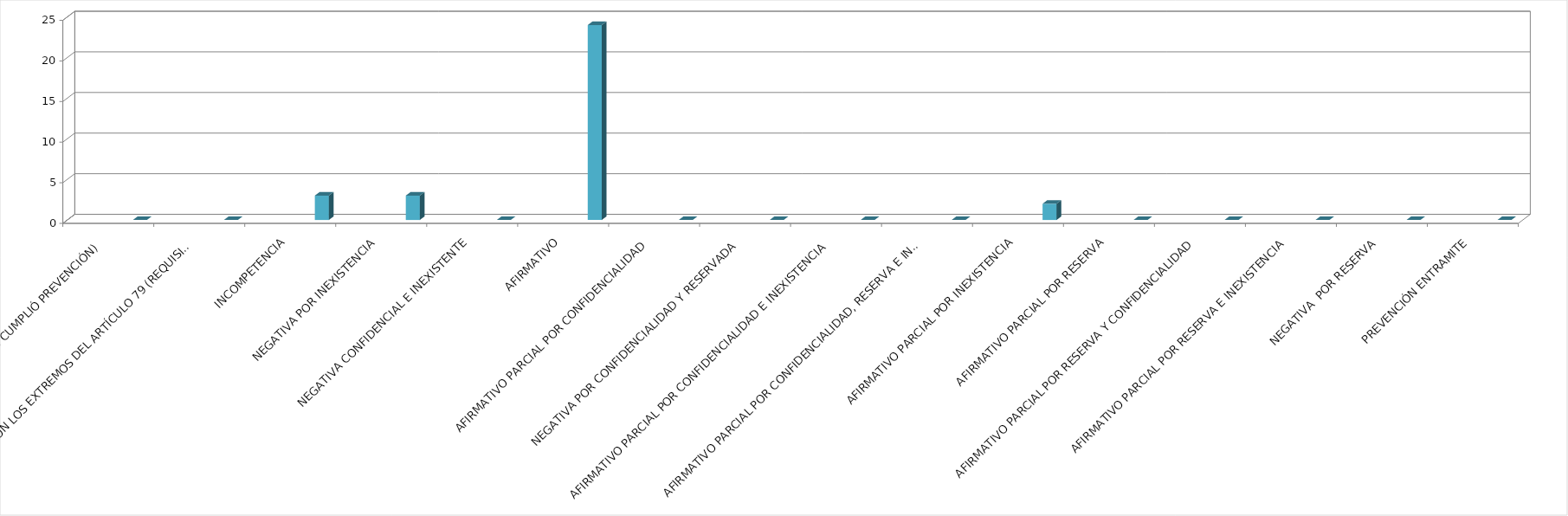
| Category | Series 0 | Series 1 | Series 2 | Series 3 | Series 4 |
|---|---|---|---|---|---|
| SE TIENE POR NO PRESENTADA ( NO CUMPLIÓ PREVENCIÓN) |  |  |  |  | 0 |
| NO CUMPLIO CON LOS EXTREMOS DEL ARTÍCULO 79 (REQUISITOS) |  |  |  |  | 0 |
| INCOMPETENCIA |  |  |  |  | 3 |
| NEGATIVA POR INEXISTENCIA |  |  |  |  | 3 |
| NEGATIVA CONFIDENCIAL E INEXISTENTE |  |  |  |  | 0 |
| AFIRMATIVO |  |  |  |  | 24 |
| AFIRMATIVO PARCIAL POR CONFIDENCIALIDAD |  |  |  |  | 0 |
| NEGATIVA POR CONFIDENCIALIDAD Y RESERVADA |  |  |  |  | 0 |
| AFIRMATIVO PARCIAL POR CONFIDENCIALIDAD E INEXISTENCIA |  |  |  |  | 0 |
| AFIRMATIVO PARCIAL POR CONFIDENCIALIDAD, RESERVA E INEXISTENCIA |  |  |  |  | 0 |
| AFIRMATIVO PARCIAL POR INEXISTENCIA |  |  |  |  | 2 |
| AFIRMATIVO PARCIAL POR RESERVA |  |  |  |  | 0 |
| AFIRMATIVO PARCIAL POR RESERVA Y CONFIDENCIALIDAD |  |  |  |  | 0 |
| AFIRMATIVO PARCIAL POR RESERVA E INEXISTENCIA |  |  |  |  | 0 |
| NEGATIVA  POR RESERVA |  |  |  |  | 0 |
| PREVENCIÓN ENTRAMITE |  |  |  |  | 0 |